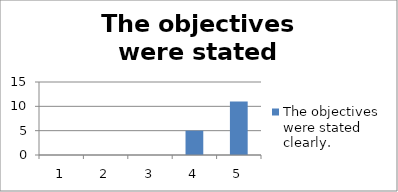
| Category | The objectives were stated clearly. |
|---|---|
| 0 | 0 |
| 1 | 0 |
| 2 | 0 |
| 3 | 5 |
| 4 | 11 |